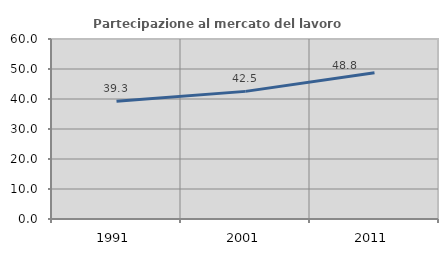
| Category | Partecipazione al mercato del lavoro  femminile |
|---|---|
| 1991.0 | 39.272 |
| 2001.0 | 42.543 |
| 2011.0 | 48.772 |